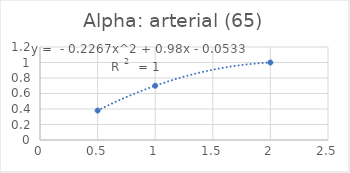
| Category | Series 0 |
|---|---|
| 0.5 | 0.38 |
| 1.0 | 0.7 |
| 2.0 | 1 |